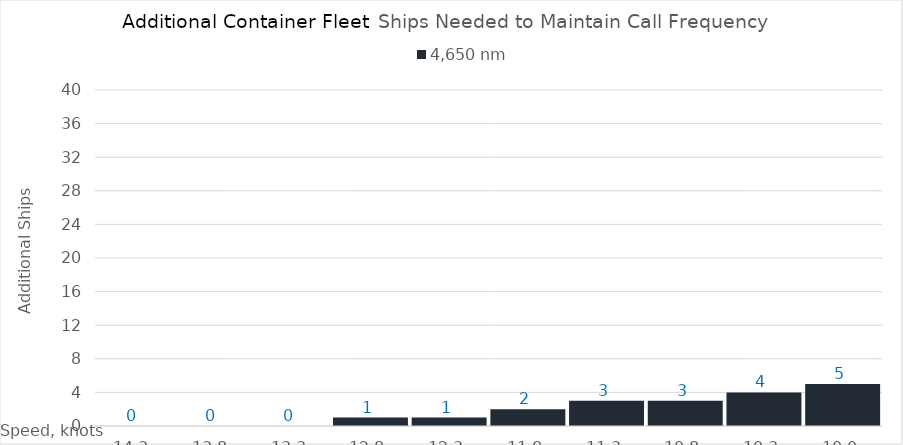
| Category | 4,650 |
|---|---|
| 14.3 | 0 |
| 13.8 | 0 |
| 13.3 | 0 |
| 12.8 | 1 |
| 12.3 | 1 |
| 11.8 | 2 |
| 11.3 | 3 |
| 10.8 | 3 |
| 10.3 | 4 |
| 10.0 | 5 |